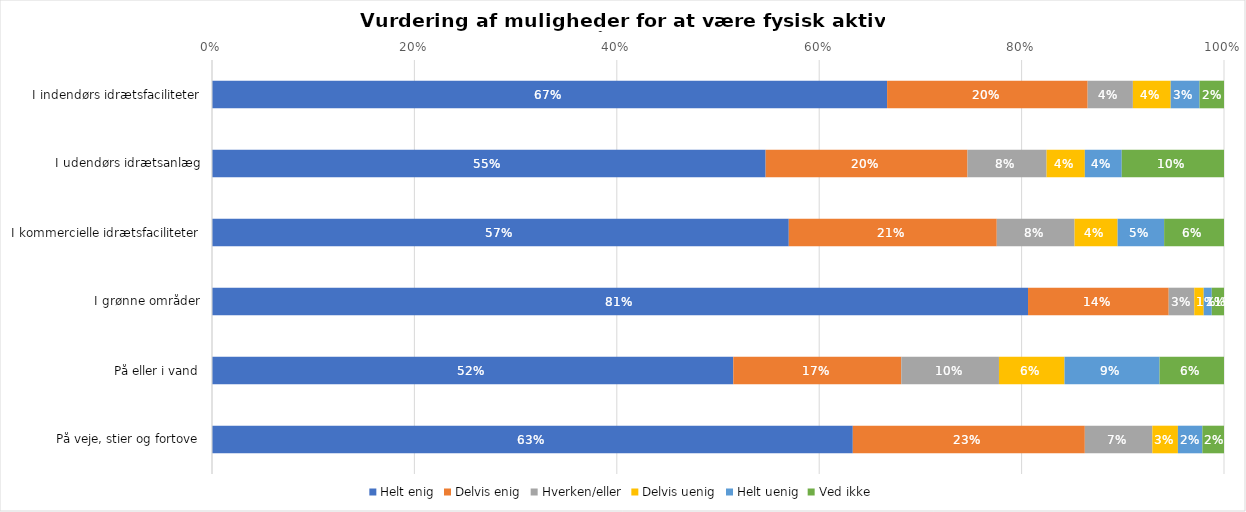
| Category | Helt enig | Delvis enig | Hverken/eller | Delvis uenig | Helt uenig | Ved ikke |
|---|---|---|---|---|---|---|
| I indendørs idrætsfaciliteter | 0.667 | 0.198 | 0.045 | 0.037 | 0.028 | 0.024 |
| I udendørs idrætsanlæg | 0.547 | 0.199 | 0.078 | 0.038 | 0.036 | 0.101 |
| I kommercielle idrætsfaciliteter | 0.57 | 0.206 | 0.077 | 0.043 | 0.046 | 0.059 |
| I grønne områder | 0.806 | 0.139 | 0.025 | 0.009 | 0.008 | 0.012 |
| På eller i vand | 0.515 | 0.166 | 0.097 | 0.065 | 0.094 | 0.064 |
| På veje, stier og fortove | 0.633 | 0.229 | 0.067 | 0.025 | 0.024 | 0.021 |